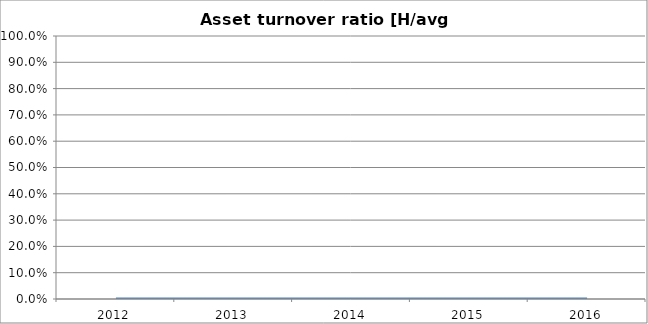
| Category | Asset turnover ratio [H/average C] |
|---|---|
| 2012.0 | 0 |
| 2013.0 | 0 |
| 2014.0 | 0 |
| 2015.0 | 0 |
| 2016.0 | 0 |